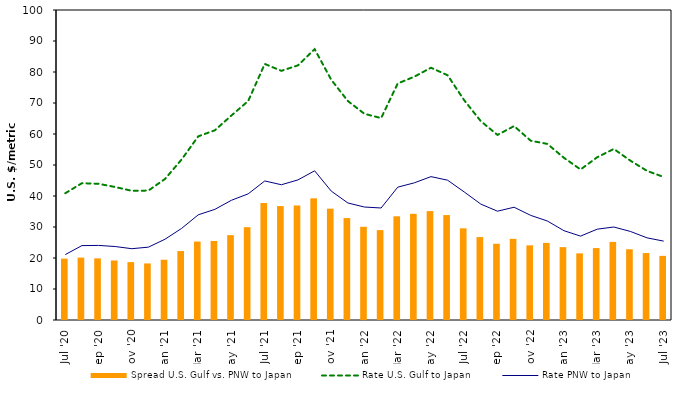
| Category | Spread |
|---|---|
| Jul '20 | 19.8 |
| Aug '20 | 20.13 |
| Sep '20 | 19.88 |
| Oct '20 | 19.2 |
| Nov '20 | 18.67 |
| Dec '20 | 18.25 |
| Jan '21 | 19.44 |
| Feb '21 | 22.24 |
| Mar '21 | 25.31 |
| Apr '21 | 25.5 |
| May '21 | 27.37 |
| Jun '21 | 29.94 |
| Jul '21 | 37.75 |
| Aug '21 | 36.75 |
| Sep '21 | 36.95 |
| Oct '21 | 39.25 |
| Nov '21 | 35.92 |
| Dec '21 | 32.88 |
| Jan '22 | 30.06 |
| Feb '22 | 29 |
| Mar '22 | 33.45 |
| Apr '22 | 34.25 |
| May '22 | 35.13 |
| Jun '22 | 33.85 |
| Jul '22 | 29.57 |
| Aug '22 | 26.75 |
| Sep '22 | 24.6 |
| Oct '22 | 26.18 |
| Nov '22 | 24.08 |
| Dec '22 | 24.87 |
| Jan '23 | 23.5 |
| Feb '23 | 21.5 |
| Mar '23 | 23.2 |
| Apr '23 | 25.19 |
| May '23 | 22.82 |
| Jun '23 | 21.6 |
| Jul '23 | 20.69 |